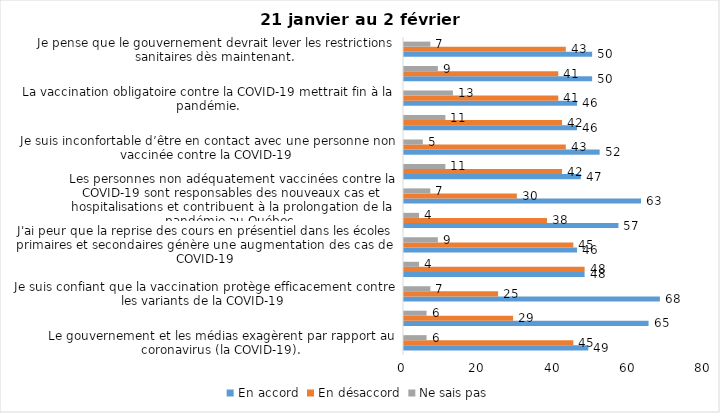
| Category | En accord | En désaccord | Ne sais pas |
|---|---|---|---|
| Le gouvernement et les médias exagèrent par rapport au coronavirus (la COVID-19). | 49 | 45 | 6 |
| J’ai peur que le système de santé soit débordé par les cas de COVID-19. | 65 | 29 | 6 |
| Je suis confiant que la vaccination protège efficacement contre les variants de la COVID-19 | 68 | 25 | 7 |
| Je suis favorable à ce que le port du masque ne soit plus obligatoire au Québec. | 48 | 48 | 4 |
| J'ai peur que la reprise des cours en présentiel dans les écoles primaires et secondaires génère une augmentation des cas de COVID-19 | 46 | 45 | 9 |
| Je crois que le passeport vaccinal devrait être requis pour davantage de services et commerces (ex. : spas, centre d’achats, centre de soins personnels. | 57 | 38 | 4 |
| Les personnes non adéquatement vaccinées contre la COVID-19 sont responsables des nouveaux cas et hospitalisations et contribuent à la prolongation de la pandémie au Québec. | 63 | 30 | 7 |
| La pandémie ne sera pas terminée au Québec avant que tous les habitants de la terre puissent être vaccinés contre la COVID-19.   | 47 | 42 | 11 |
| Je suis inconfortable d’être en contact avec une personne non vaccinée contre la COVID-19 | 52 | 43 | 5 |
| Je n'ai pas peur du variant Omicron, car il semble moins dangereux pour la santé. | 46 | 42 | 11 |
| La vaccination obligatoire contre la COVID-19 mettrait fin à la pandémie. | 46 | 41 | 13 |
| Je suis favorable à ce que les personnes non vaccinées paient une taxe supplémentaire (contribution santé). | 50 | 41 | 9 |
| Je pense que le gouvernement devrait lever les restrictions sanitaires dès maintenant. | 50 | 43 | 7 |